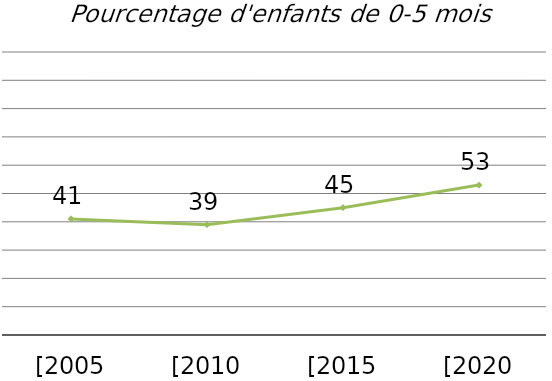
| Category | Pourcentage d'enfants de 0-5 mois qui sont exclusivement allaités  |
|---|---|
| [2005 xDHS] | 41 |
| [2010 xDHS] | 39 |
| [2015 xDHS] | 45 |
| [2020 xDHS] | 53 |